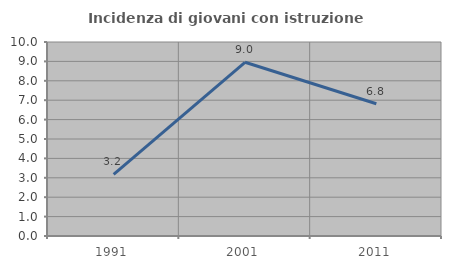
| Category | Incidenza di giovani con istruzione universitaria |
|---|---|
| 1991.0 | 3.175 |
| 2001.0 | 8.955 |
| 2011.0 | 6.818 |